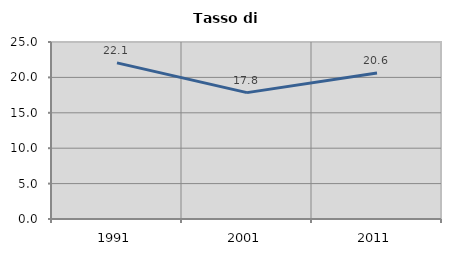
| Category | Tasso di disoccupazione   |
|---|---|
| 1991.0 | 22.051 |
| 2001.0 | 17.85 |
| 2011.0 | 20.607 |